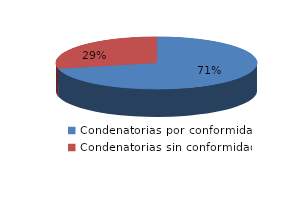
| Category | Series 0 |
|---|---|
| 0 | 10506 |
| 1 | 4202 |